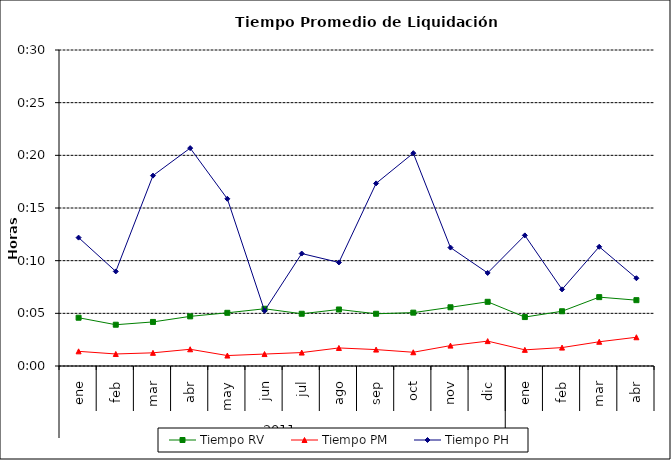
| Category | Tiempo RV | Tiempo PM | Tiempo PH |
|---|---|---|---|
| 0 | 0.003 | 0.001 | 0.009 |
| 1 | 0.003 | 0.001 | 0.006 |
| 2 | 0.003 | 0.001 | 0.013 |
| 3 | 0.003 | 0.001 | 0.014 |
| 4 | 0.004 | 0.001 | 0.011 |
| 5 | 0.004 | 0.001 | 0.004 |
| 6 | 0.003 | 0.001 | 0.007 |
| 7 | 0.004 | 0.001 | 0.007 |
| 8 | 0.003 | 0.001 | 0.012 |
| 9 | 0.004 | 0.001 | 0.014 |
| 10 | 0.004 | 0.001 | 0.008 |
| 11 | 0.004 | 0.002 | 0.006 |
| 12 | 0.003 | 0.001 | 0.009 |
| 13 | 0.004 | 0.001 | 0.005 |
| 14 | 0.005 | 0.002 | 0.008 |
| 15 | 0.004 | 0.002 | 0.006 |